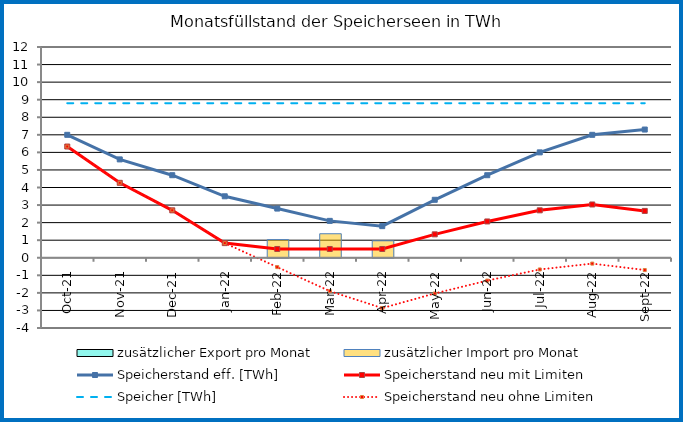
| Category | zusätzlicher Export pro Monat | zusätzlicher Import pro Monat |
|---|---|---|
| 0 | 0 | 0 |
| 1900-01-01 | 0 | 0 |
| 1900-01-02 | 0 | 0 |
| 1900-01-03 | 0 | 0 |
| 1900-01-04 | 0 | 1.033 |
| 1900-01-05 | 0 | 1.367 |
| 1900-01-06 | 0 | 0.967 |
| 1900-01-07 | 0 | 0 |
| 1900-01-08 | 0 | 0 |
| 1900-01-09 | 0 | 0 |
| 1900-01-10 | 0 | 0 |
| 1900-01-11 | 0 | 0 |